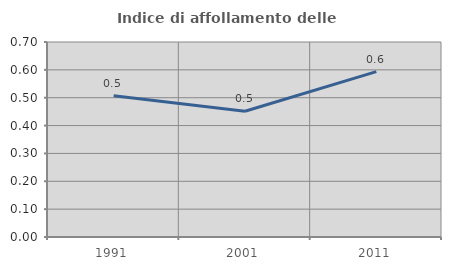
| Category | Indice di affollamento delle abitazioni  |
|---|---|
| 1991.0 | 0.507 |
| 2001.0 | 0.451 |
| 2011.0 | 0.594 |